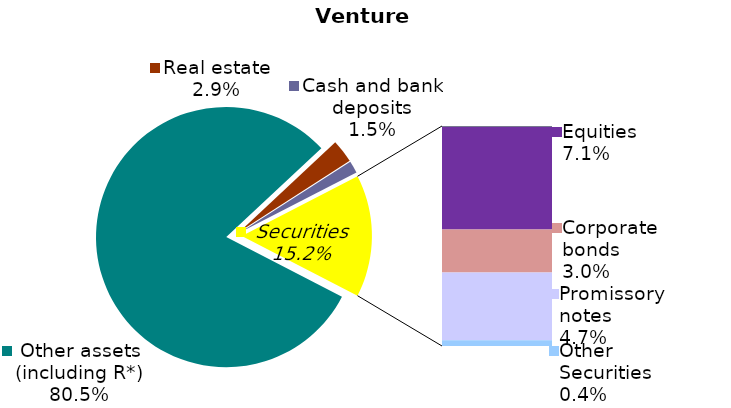
| Category | Series 0 |
|---|---|
| Other assets (including R*) | 0.805 |
| Real estate | 0.029 |
| Cash and bank deposits | 0.015 |
| Bank metals | 0 |
| State bonds (OVDP) | 0 |
| Equities | 0.071 |
| Corporate bonds | 0.03 |
| Promissory notes | 0.047 |
| Mortgages | 0 |
| Other Securities | 0.004 |